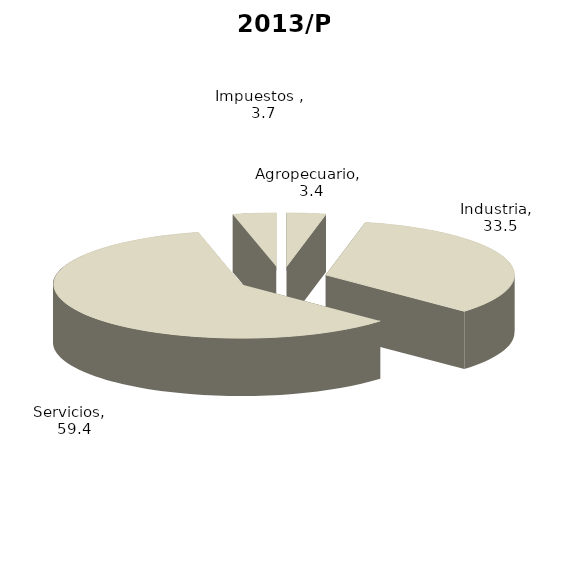
| Category | 2013/P |
|---|---|
| Agropecuario | 3.355 |
| Industria | 33.52 |
| Servicios | 59.425 |
| Impuestos  | 3.7 |